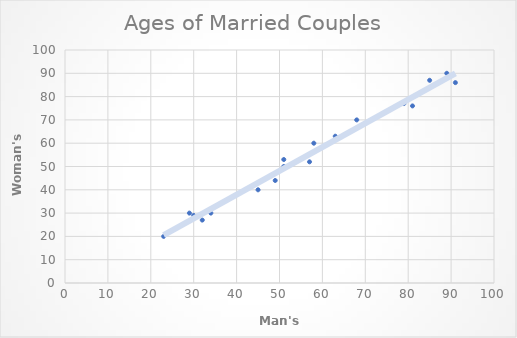
| Category | Ages of Married Couples |
|---|---|
| 30.0 | 29 |
| 32.0 | 27 |
| 45.0 | 40 |
| 85.0 | 87 |
| 51.0 | 53 |
| 23.0 | 20 |
| 68.0 | 70 |
| 89.0 | 90 |
| 29.0 | 30 |
| 91.0 | 86 |
| 81.0 | 76 |
| 51.0 | 50 |
| 57.0 | 52 |
| 49.0 | 44 |
| 63.0 | 63 |
| 34.0 | 30 |
| 79.0 | 77 |
| 58.0 | 60 |